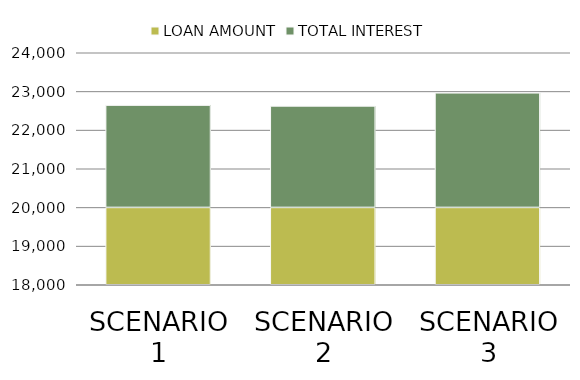
| Category | LOAN AMOUNT | TOTAL INTEREST |
|---|---|---|
| SCENARIO 1 | 20000 | 2645.48 |
| SCENARIO 2 | 20000 | 2624.776 |
| SCENARIO 3 | 20000 | 2963.595 |